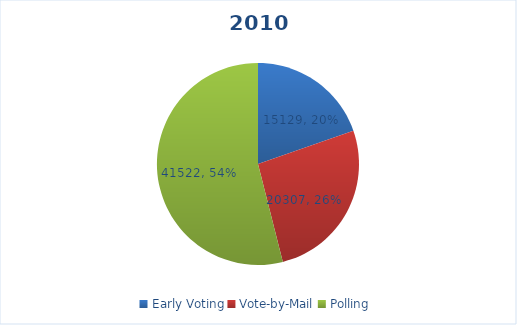
| Category | Series 0 |
|---|---|
| Early Voting | 15129 |
| Vote-by-Mail | 20307 |
| Polling | 41522 |